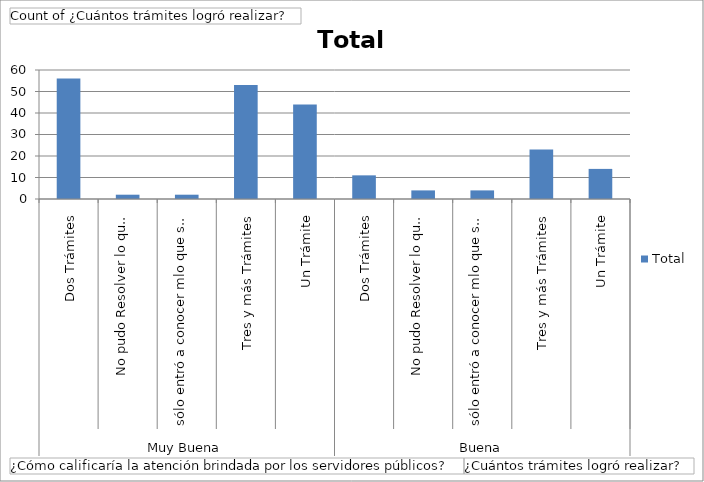
| Category | Total |
|---|---|
| 0 | 56 |
| 1 | 2 |
| 2 | 2 |
| 3 | 53 |
| 4 | 44 |
| 5 | 11 |
| 6 | 4 |
| 7 | 4 |
| 8 | 23 |
| 9 | 14 |